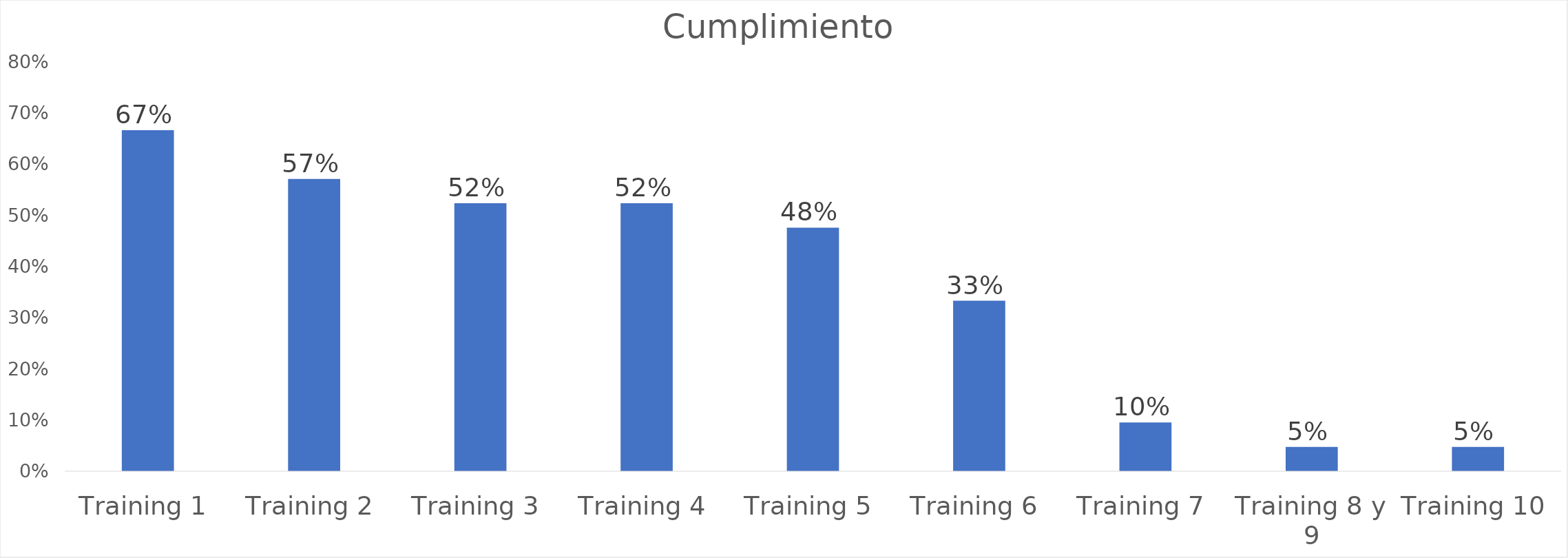
| Category | Cumplimiento |
|---|---|
| Training 1 | 0.667 |
| Training 2 | 0.571 |
| Training 3 | 0.524 |
| Training 4 | 0.524 |
| Training 5 | 0.476 |
| Training 6 | 0.333 |
| Training 7 | 0.095 |
| Training 8 y 9 | 0.048 |
| Training 10 | 0.048 |